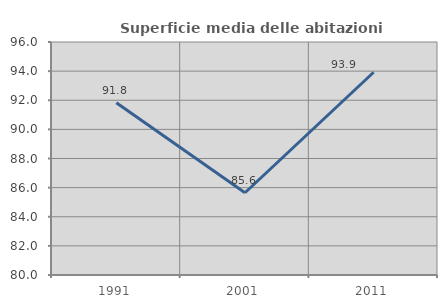
| Category | Superficie media delle abitazioni occupate |
|---|---|
| 1991.0 | 91.824 |
| 2001.0 | 85.647 |
| 2011.0 | 93.925 |